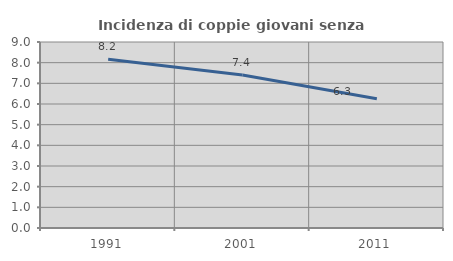
| Category | Incidenza di coppie giovani senza figli |
|---|---|
| 1991.0 | 8.163 |
| 2001.0 | 7.407 |
| 2011.0 | 6.25 |